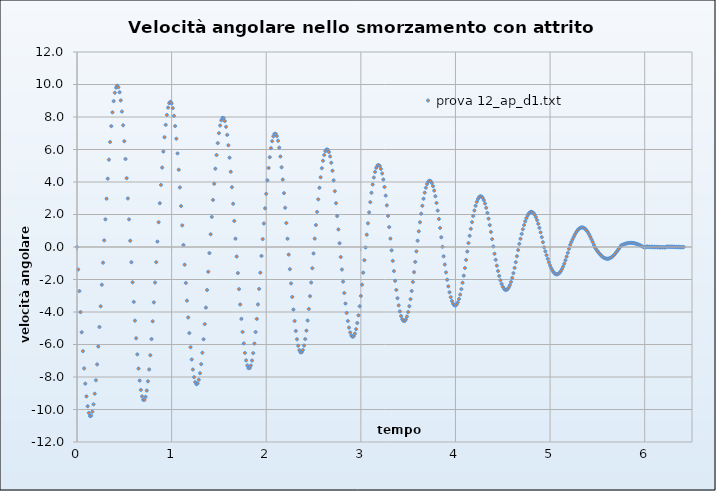
| Category | prova 12_ap_d1.txt |
|---|---|
| 0.0 | 0 |
| 0.012499999999999956 | -1.382 |
| 0.02499999999999991 | -2.713 |
| 0.03749999999999987 | -4.007 |
| 0.050000000000000044 | -5.247 |
| 0.0625 | -6.41 |
| 0.07499999999999996 | -7.473 |
| 0.08749999999999991 | -8.409 |
| 0.09999999999999987 | -9.192 |
| 0.11250000000000004 | -9.8 |
| 0.125 | -10.209 |
| 0.13749999999999996 | -10.406 |
| 0.1499999999999999 | -10.382 |
| 0.16249999999999987 | -10.138 |
| 0.17500000000000004 | -9.682 |
| 0.1875 | -9.029 |
| 0.19999999999999996 | -8.202 |
| 0.2124999999999999 | -7.224 |
| 0.22499999999999987 | -6.123 |
| 0.23750000000000004 | -4.923 |
| 0.25 | -3.649 |
| 0.26249999999999996 | -2.322 |
| 0.2749999999999999 | -0.965 |
| 0.28749999999999987 | 0.406 |
| 0.30000000000000004 | 1.701 |
| 0.3125 | 2.974 |
| 0.32499999999999996 | 4.205 |
| 0.3374999999999999 | 5.374 |
| 0.34999999999999987 | 6.46 |
| 0.36250000000000004 | 7.438 |
| 0.375 | 8.286 |
| 0.38749999999999996 | 8.977 |
| 0.40000000000000013 | 9.492 |
| 0.41249999999999987 | 9.812 |
| 0.42500000000000004 | 9.926 |
| 0.4374999999999998 | 9.829 |
| 0.44999999999999996 | 9.523 |
| 0.46250000000000013 | 9.02 |
| 0.47499999999999987 | 8.335 |
| 0.48750000000000004 | 7.49 |
| 0.4999999999999998 | 6.509 |
| 0.5125 | 5.416 |
| 0.5250000000000001 | 4.235 |
| 0.5374999999999999 | 2.989 |
| 0.55 | 1.699 |
| 0.5624999999999998 | 0.384 |
| 0.575 | -0.935 |
| 0.5875000000000001 | -2.172 |
| 0.5999999999999999 | -3.377 |
| 0.6125 | -4.532 |
| 0.6249999999999998 | -5.616 |
| 0.6375 | -6.607 |
| 0.6500000000000001 | -7.482 |
| 0.6624999999999999 | -8.219 |
| 0.675 | -8.797 |
| 0.6874999999999998 | -9.196 |
| 0.7 | -9.404 |
| 0.7125000000000001 | -9.412 |
| 0.7249999999999999 | -9.22 |
| 0.7375 | -8.834 |
| 0.7499999999999998 | -8.266 |
| 0.7625 | -7.535 |
| 0.7750000000000001 | -6.66 |
| 0.7874999999999999 | -5.665 |
| 0.8 | -4.573 |
| 0.8124999999999998 | -3.406 |
| 0.825 | -2.187 |
| 0.8375000000000001 | -0.934 |
| 0.8499999999999999 | 0.333 |
| 0.8625 | 1.524 |
| 0.8749999999999998 | 2.693 |
| 0.8875 | 3.821 |
| 0.9000000000000001 | 4.888 |
| 0.9124999999999999 | 5.874 |
| 0.925 | 6.756 |
| 0.9374999999999998 | 7.515 |
| 0.95 | 8.129 |
| 0.9625000000000001 | 8.579 |
| 0.9749999999999999 | 8.852 |
| 0.9875 | 8.939 |
| 0.9999999999999998 | 8.835 |
| 1.0125 | 8.544 |
| 1.0250000000000001 | 8.075 |
| 1.0374999999999999 | 7.442 |
| 1.05 | 6.664 |
| 1.0624999999999998 | 5.76 |
| 1.075 | 4.754 |
| 1.0875000000000001 | 3.666 |
| 1.0999999999999999 | 2.518 |
| 1.1125 | 1.33 |
| 1.1249999999999998 | 0.121 |
| 1.1375 | -1.089 |
| 1.1500000000000001 | -2.213 |
| 1.1624999999999999 | -3.302 |
| 1.175 | -4.337 |
| 1.1874999999999998 | -5.298 |
| 1.2 | -6.166 |
| 1.2125000000000001 | -6.92 |
| 1.2249999999999999 | -7.541 |
| 1.2375 | -8.011 |
| 1.2499999999999998 | -8.316 |
| 1.2625 | -8.446 |
| 1.2750000000000001 | -8.396 |
| 1.2874999999999999 | -8.168 |
| 1.3 | -7.768 |
| 1.3124999999999998 | -7.209 |
| 1.325 | -6.506 |
| 1.3375000000000001 | -5.679 |
| 1.3499999999999999 | -4.746 |
| 1.3625 | -3.729 |
| 1.3749999999999998 | -2.648 |
| 1.3875 | -1.523 |
| 1.4000000000000001 | -0.374 |
| 1.4124999999999999 | 0.782 |
| 1.425 | 1.854 |
| 1.4374999999999998 | 2.897 |
| 1.45 | 3.891 |
| 1.4625000000000001 | 4.818 |
| 1.4749999999999999 | 5.659 |
| 1.4875 | 6.394 |
| 1.4999999999999998 | 7.005 |
| 1.5125 | 7.476 |
| 1.5250000000000001 | 7.793 |
| 1.5374999999999999 | 7.947 |
| 1.55 | 7.931 |
| 1.5624999999999998 | 7.747 |
| 1.575 | 7.4 |
| 1.5875000000000001 | 6.899 |
| 1.5999999999999999 | 6.259 |
| 1.6125 | 5.497 |
| 1.6249999999999998 | 4.63 |
| 1.6375 | 3.679 |
| 1.6500000000000001 | 2.663 |
| 1.6624999999999999 | 1.601 |
| 1.675 | 0.512 |
| 1.6874999999999998 | -0.586 |
| 1.7 | -1.604 |
| 1.7125000000000001 | -2.595 |
| 1.7249999999999999 | -3.541 |
| 1.7375 | -4.424 |
| 1.7499999999999998 | -5.227 |
| 1.7625 | -5.931 |
| 1.7750000000000001 | -6.52 |
| 1.7874999999999999 | -6.977 |
| 1.8 | -7.291 |
| 1.8124999999999998 | -7.451 |
| 1.825 | -7.454 |
| 1.8375000000000001 | -7.297 |
| 1.8499999999999999 | -6.987 |
| 1.8625 | -6.53 |
| 1.8749999999999998 | -5.941 |
| 1.8875 | -5.234 |
| 1.9000000000000001 | -4.426 |
| 1.9124999999999999 | -3.535 |
| 1.925 | -2.58 |
| 1.9374999999999998 | -1.579 |
| 1.95 | -0.551 |
| 1.9625000000000001 | 0.487 |
| 1.9749999999999999 | 1.446 |
| 1.9875 | 2.381 |
| 1.9999999999999998 | 3.273 |
| 2.0125 | 4.106 |
| 2.0250000000000004 | 4.862 |
| 2.0374999999999996 | 5.526 |
| 2.05 | 6.08 |
| 2.0625 | 6.512 |
| 2.075 | 6.809 |
| 2.0875000000000004 | 6.963 |
| 2.0999999999999996 | 6.969 |
| 2.1125 | 6.826 |
| 2.125 | 6.539 |
| 2.1375 | 6.116 |
| 2.1500000000000004 | 5.567 |
| 2.1624999999999996 | 4.906 |
| 2.175 | 4.149 |
| 2.1875 | 3.314 |
| 2.2 | 2.417 |
| 2.2125000000000004 | 1.475 |
| 2.2249999999999996 | 0.508 |
| 2.2375 | -0.469 |
| 2.25 | -1.367 |
| 2.2625 | -2.241 |
| 2.2750000000000004 | -3.074 |
| 2.2874999999999996 | -3.85 |
| 2.3 | -4.553 |
| 2.3125 | -5.168 |
| 2.325 | -5.68 |
| 2.3375000000000004 | -6.076 |
| 2.3499999999999996 | -6.345 |
| 2.3625 | -6.481 |
| 2.375 | -6.48 |
| 2.3875 | -6.34 |
| 2.4000000000000004 | -6.066 |
| 2.4125000000000005 | -5.665 |
| 2.425 | -5.147 |
| 2.4375 | -4.526 |
| 2.45 | -3.814 |
| 2.4625000000000004 | -3.03 |
| 2.4750000000000005 | -2.187 |
| 2.4875 | -1.304 |
| 2.5 | -0.397 |
| 2.5125 | 0.517 |
| 2.5250000000000004 | 1.352 |
| 2.5375000000000005 | 2.162 |
| 2.55 | 2.931 |
| 2.5625 | 3.645 |
| 2.575 | 4.289 |
| 2.5875000000000004 | 4.848 |
| 2.6000000000000005 | 5.309 |
| 2.6125 | 5.661 |
| 2.625 | 5.895 |
| 2.6375 | 6.004 |
| 2.6500000000000004 | 5.986 |
| 2.6625000000000005 | 5.84 |
| 2.675 | 5.571 |
| 2.6875 | 5.185 |
| 2.7 | 4.691 |
| 2.7125000000000004 | 4.103 |
| 2.7250000000000005 | 3.432 |
| 2.7375 | 2.694 |
| 2.75 | 1.905 |
| 2.7625 | 1.079 |
| 2.7750000000000004 | 0.233 |
| 2.7875000000000005 | -0.617 |
| 2.8 | -1.386 |
| 2.8125 | -2.129 |
| 2.825 | -2.831 |
| 2.8375000000000004 | -3.478 |
| 2.8500000000000005 | -4.057 |
| 2.8625 | -4.554 |
| 2.875 | -4.959 |
| 2.8875 | -5.261 |
| 2.9000000000000004 | -5.452 |
| 2.9125000000000005 | -5.528 |
| 2.925 | -5.486 |
| 2.9375 | -5.328 |
| 2.95 | -5.057 |
| 2.9625000000000004 | -4.68 |
| 2.9750000000000005 | -4.205 |
| 2.9875 | -3.645 |
| 3.0 | -3.012 |
| 3.0125 | -2.319 |
| 3.0250000000000004 | -1.581 |
| 3.0375000000000005 | -0.812 |
| 3.05 | -0.028 |
| 3.0625 | 0.757 |
| 3.075 | 1.457 |
| 3.0875000000000004 | 2.129 |
| 3.1000000000000005 | 2.76 |
| 3.1125 | 3.336 |
| 3.125 | 3.846 |
| 3.1375 | 4.277 |
| 3.1500000000000004 | 4.62 |
| 3.1625000000000005 | 4.866 |
| 3.175 | 5.01 |
| 3.1875 | 5.048 |
| 3.2 | 4.978 |
| 3.2125000000000004 | 4.802 |
| 3.2250000000000005 | 4.525 |
| 3.2375 | 4.153 |
| 3.25 | 3.695 |
| 3.2625 | 3.161 |
| 3.2750000000000004 | 2.563 |
| 3.2875000000000005 | 1.914 |
| 3.3 | 1.227 |
| 3.3125 | 0.516 |
| 3.325 | -0.206 |
| 3.3375000000000004 | -0.853 |
| 3.3500000000000005 | -1.483 |
| 3.3625 | -2.084 |
| 3.375 | -2.644 |
| 3.3875 | -3.151 |
| 3.4000000000000004 | -3.594 |
| 3.4125000000000005 | -3.963 |
| 3.425 | -4.249 |
| 3.4375 | -4.446 |
| 3.45 | -4.55 |
| 3.4625000000000004 | -4.556 |
| 3.4750000000000005 | -4.466 |
| 3.4875 | -4.28 |
| 3.5 | -4.004 |
| 3.5125 | -3.644 |
| 3.5250000000000004 | -3.208 |
| 3.5375000000000005 | -2.707 |
| 3.55 | -2.15 |
| 3.5625 | -1.549 |
| 3.575 | -0.918 |
| 3.5875000000000004 | -0.268 |
| 3.6000000000000005 | 0.386 |
| 3.6125 | 0.964 |
| 3.625 | 1.522 |
| 3.6375 | 2.049 |
| 3.6500000000000004 | 2.536 |
| 3.6625000000000005 | 2.97 |
| 3.675 | 3.344 |
| 3.6875 | 3.648 |
| 3.7 | 3.875 |
| 3.7125000000000004 | 4.021 |
| 3.7250000000000005 | 4.082 |
| 3.7375 | 4.055 |
| 3.75 | 3.943 |
| 3.7625 | 3.746 |
| 3.7750000000000004 | 3.471 |
| 3.7875000000000005 | 3.122 |
| 3.8 | 2.709 |
| 3.8125 | 2.239 |
| 3.825 | 1.724 |
| 3.8375000000000004 | 1.173 |
| 3.8500000000000005 | 0.599 |
| 3.8625 | 0.013 |
| 3.875 | -0.574 |
| 3.8875 | -1.079 |
| 3.9000000000000004 | -1.562 |
| 3.9125000000000005 | -2.014 |
| 3.925 | -2.424 |
| 3.9375 | -2.784 |
| 3.95 | -3.086 |
| 3.9625000000000004 | -3.324 |
| 3.9750000000000005 | -3.492 |
| 3.9875 | -3.585 |
| 4.0 | -3.603 |
| 4.0125 | -3.543 |
| 4.025 | -3.409 |
| 4.0375000000000005 | -3.202 |
| 4.05 | -2.927 |
| 4.0625 | -2.591 |
| 4.075 | -2.201 |
| 4.0875 | -1.765 |
| 4.1000000000000005 | -1.292 |
| 4.1125 | -0.793 |
| 4.125 | -0.278 |
| 4.1375 | 0.243 |
| 4.15 | 0.688 |
| 4.1625000000000005 | 1.12 |
| 4.175 | 1.529 |
| 4.1875 | 1.906 |
| 4.2 | 2.244 |
| 4.2125 | 2.535 |
| 4.2250000000000005 | 2.773 |
| 4.2375 | 2.953 |
| 4.25 | 3.07 |
| 4.2625 | 3.122 |
| 4.275 | 3.107 |
| 4.2875000000000005 | 3.026 |
| 4.3 | 2.881 |
| 4.3125 | 2.675 |
| 4.325 | 2.412 |
| 4.3375 | 2.099 |
| 4.3500000000000005 | 1.741 |
| 4.3625 | 1.347 |
| 4.375 | 0.926 |
| 4.3875 | 0.485 |
| 4.4 | 0.034 |
| 4.4125000000000005 | -0.418 |
| 4.425 | -0.791 |
| 4.4375 | -1.148 |
| 4.45 | -1.481 |
| 4.4625 | -1.783 |
| 4.4750000000000005 | -2.047 |
| 4.4875 | -2.269 |
| 4.5 | -2.443 |
| 4.5125 | -2.565 |
| 4.525 | -2.633 |
| 4.5375000000000005 | -2.645 |
| 4.55 | -2.6 |
| 4.5625 | -2.5 |
| 4.575 | -2.347 |
| 4.5875 | -2.144 |
| 4.6000000000000005 | -1.896 |
| 4.6125 | -1.608 |
| 4.625 | -1.286 |
| 4.6375 | -0.937 |
| 4.65 | -0.568 |
| 4.6625000000000005 | -0.188 |
| 4.675 | 0.196 |
| 4.6875 | 0.506 |
| 4.7 | 0.806 |
| 4.7125 | 1.089 |
| 4.7250000000000005 | 1.349 |
| 4.7375 | 1.581 |
| 4.75 | 1.779 |
| 4.7625 | 1.94 |
| 4.775 | 2.059 |
| 4.7875000000000005 | 2.136 |
| 4.8 | 2.166 |
| 4.8125 | 2.151 |
| 4.825 | 2.089 |
| 4.8375 | 1.984 |
| 4.8500000000000005 | 1.836 |
| 4.8625 | 1.649 |
| 4.875 | 1.427 |
| 4.8875 | 1.175 |
| 4.9 | 0.899 |
| 4.9125000000000005 | 0.603 |
| 4.925 | 0.295 |
| 4.9375 | -0.02 |
| 4.95 | -0.264 |
| 4.9625 | -0.503 |
| 4.9750000000000005 | -0.731 |
| 4.9875 | -0.943 |
| 5.0 | -1.136 |
| 5.0125 | -1.305 |
| 5.025 | -1.446 |
| 5.0375000000000005 | -1.556 |
| 5.05 | -1.634 |
| 5.0625 | -1.677 |
| 5.075 | -1.684 |
| 5.0875 | -1.655 |
| 5.1000000000000005 | -1.591 |
| 5.1125 | -1.493 |
| 5.125 | -1.363 |
| 5.1375 | -1.205 |
| 5.15 | -1.021 |
| 5.1625000000000005 | -0.815 |
| 5.175 | -0.592 |
| 5.1875 | -0.356 |
| 5.2 | -0.113 |
| 5.2125 | 0.132 |
| 5.2250000000000005 | 0.305 |
| 5.2375 | 0.471 |
| 5.25 | 0.627 |
| 5.2625 | 0.77 |
| 5.275 | 0.897 |
| 5.2875000000000005 | 1.005 |
| 5.3 | 1.091 |
| 5.3125 | 1.154 |
| 5.325 | 1.193 |
| 5.3375 | 1.206 |
| 5.3500000000000005 | 1.193 |
| 5.3625 | 1.156 |
| 5.375 | 1.093 |
| 5.3875 | 1.007 |
| 5.4 | 0.9 |
| 5.4125000000000005 | 0.774 |
| 5.425 | 0.631 |
| 5.4375 | 0.475 |
| 5.45 | 0.309 |
| 5.4625 | 0.136 |
| 5.4750000000000005 | -0.04 |
| 5.4875 | -0.144 |
| 5.5 | -0.246 |
| 5.5125 | -0.343 |
| 5.525 | -0.432 |
| 5.5375000000000005 | -0.512 |
| 5.55 | -0.581 |
| 5.5625 | -0.638 |
| 5.575 | -0.682 |
| 5.5875 | -0.71 |
| 5.6000000000000005 | -0.724 |
| 5.6125 | -0.722 |
| 5.625 | -0.705 |
| 5.6375 | -0.673 |
| 5.65 | -0.627 |
| 5.6625000000000005 | -0.567 |
| 5.675 | -0.495 |
| 5.6875 | -0.413 |
| 5.7 | -0.321 |
| 5.7125 | -0.223 |
| 5.7250000000000005 | -0.121 |
| 5.7375 | -0.015 |
| 5.75 | 0.09 |
| 5.7625 | 0.124 |
| 5.775 | 0.155 |
| 5.7875000000000005 | 0.183 |
| 5.8 | 0.207 |
| 5.8125 | 0.226 |
| 5.825 | 0.241 |
| 5.8375 | 0.251 |
| 5.8500000000000005 | 0.255 |
| 5.8625 | 0.254 |
| 5.875 | 0.247 |
| 5.8875 | 0.235 |
| 5.9 | 0.218 |
| 5.9125000000000005 | 0.197 |
| 5.925 | 0.171 |
| 5.9375 | 0.142 |
| 5.95 | 0.109 |
| 5.9625 | 0.075 |
| 5.9750000000000005 | 0.038 |
| 5.9875 | 0.001 |
| 6.0 | -0.036 |
| 6.0125 | -0.002 |
| 6.025 | 0.032 |
| 6.0375000000000005 | -0.005 |
| 6.05 | 0.028 |
| 6.0625 | -0.01 |
| 6.075 | 0.023 |
| 6.0875 | -0.015 |
| 6.1000000000000005 | 0.018 |
| 6.1125 | -0.02 |
| 6.125 | 0.013 |
| 6.1375 | -0.025 |
| 6.15 | 0.008 |
| 6.1625000000000005 | -0.029 |
| 6.175 | 0.004 |
| 6.1875 | -0.033 |
| 6.2 | 0.001 |
| 6.2125 | -0.035 |
| 6.2250000000000005 | 0 |
| 6.2375 | 0.034 |
| 6.25 | -0.002 |
| 6.2625 | 0.032 |
| 6.275 | -0.004 |
| 6.2875000000000005 | 0.029 |
| 6.3 | -0.008 |
| 6.3125 | 0.025 |
| 6.325 | -0.013 |
| 6.3375 | 0.02 |
| 6.3500000000000005 | -0.018 |
| 6.3625 | 0.015 |
| 6.375 | -0.023 |
| 6.3875 | 0.01 |
| 6.3999999999999995 | -0.027 |
| 6.4125000000000005 | 0.006 |